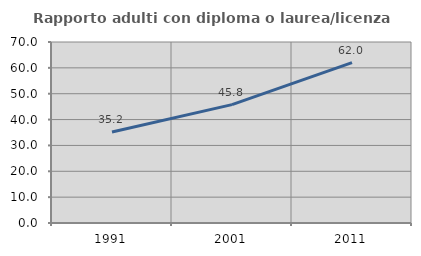
| Category | Rapporto adulti con diploma o laurea/licenza media  |
|---|---|
| 1991.0 | 35.209 |
| 2001.0 | 45.776 |
| 2011.0 | 62.019 |